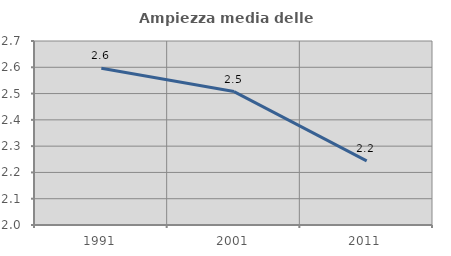
| Category | Ampiezza media delle famiglie |
|---|---|
| 1991.0 | 2.596 |
| 2001.0 | 2.508 |
| 2011.0 | 2.244 |